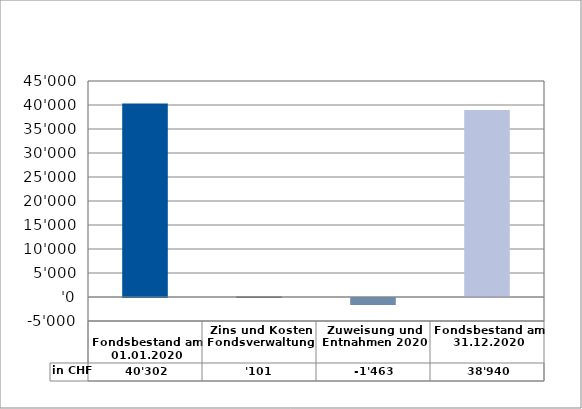
| Category | in CHF |
|---|---|
| 
Fondsbestand am 01.01.2020

 | 40302.35 |
| Zins und Kosten Fondsverwaltung | 100.75 |
| Zuweisung und Entnahmen 2020 | -1463 |
| Fondsbestand am 31.12.2020 | 38940.1 |